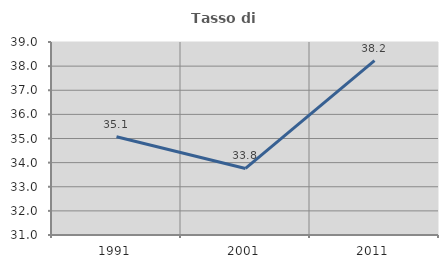
| Category | Tasso di occupazione   |
|---|---|
| 1991.0 | 35.072 |
| 2001.0 | 33.759 |
| 2011.0 | 38.226 |